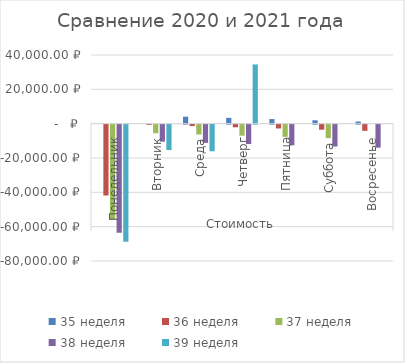
| Category | 35 неделя | 36 неделя | 37 неделя | 38 неделя | 39 неделя |
|---|---|---|---|---|---|
| 0 | 0 | -41255.28 | -55047.11 | -62944.75 | -68189.63 |
| 1 | 0 | -117.06 | -5011.67 | -9906.28 | -14800.89 |
| 2 | 4078.32 | -816.29 | -5710.9 | -10605.51 | -15500.12 |
| 3 | 3379.09 | -1515.52 | -6410.13 | -11304.74 | 34498.24 |
| 4 | 2679.86 | -2214.75 | -7109.36 | -12003.97 | 0 |
| 5 | 1980.63 | -2913.98 | -7808.59 | -12703.2 | 0 |
| 6 | 1281.4 | -3613.21 | 0 | -13402.43 | 0 |